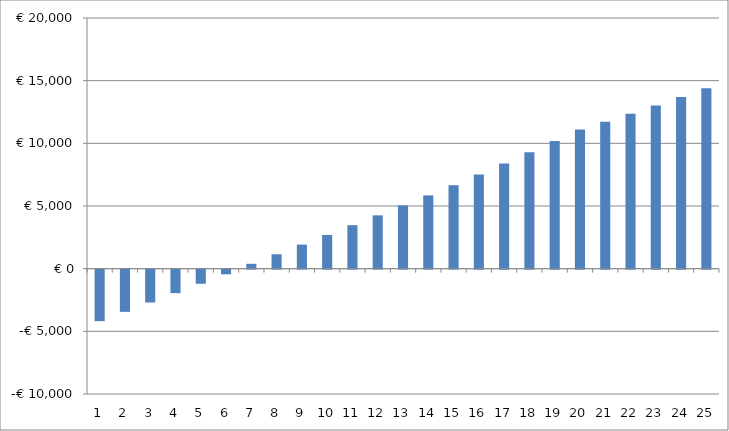
| Category | Series 0 |
|---|---|
| 0 | -7885.9 |
| 1 | -6416.797 |
| 2 | -4952.204 |
| 3 | -3491.624 |
| 4 | -2034.541 |
| 5 | -580.43 |
| 6 | 871.253 |
| 7 | 2321.066 |
| 8 | 3769.584 |
| 9 | 5217.399 |
| 10 | 6665.121 |
| 11 | 8113.378 |
| 12 | 9562.818 |
| 13 | 11014.11 |
| 14 | 12467.943 |
| 15 | 13975.028 |
| 16 | 15486.1 |
| 17 | 17001.916 |
| 18 | 18523.262 |
| 19 | 20050.945 |
| 20 | 21161.313 |
| 21 | 22282.64 |
| 22 | 23415.794 |
| 23 | 24561.673 |
| 24 | 25721.207 |